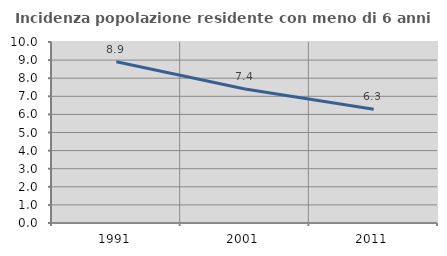
| Category | Incidenza popolazione residente con meno di 6 anni |
|---|---|
| 1991.0 | 8.904 |
| 2001.0 | 7.403 |
| 2011.0 | 6.284 |